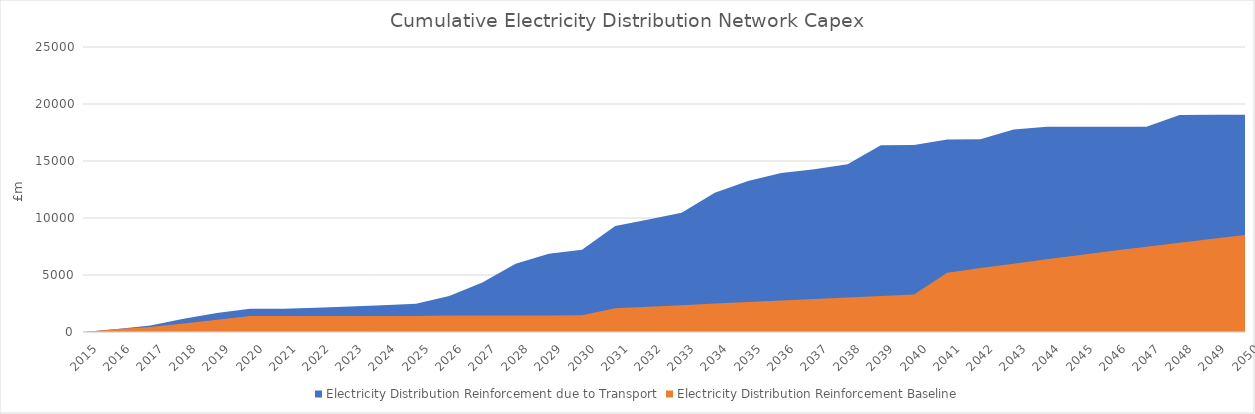
| Category | Electricity Distribution Reinforcement due to Transport | Electricity Distribution Reinforcement Baseline |
|---|---|---|
| 2015.0 | 0 | 0 |
| 2016.0 | 254.519 | 256.464 |
| 2017.0 | 573.45 | 440.448 |
| 2018.0 | 1169.89 | 741.664 |
| 2019.0 | 1665.083 | 1075.495 |
| 2020.0 | 2029.197 | 1403.056 |
| 2021.0 | 2037.778 | 1403.056 |
| 2022.0 | 2136.777 | 1403.056 |
| 2023.0 | 2238.898 | 1403.056 |
| 2024.0 | 2344.758 | 1403.056 |
| 2025.0 | 2471.359 | 1403.056 |
| 2026.0 | 3148.215 | 1438.606 |
| 2027.0 | 4341.44 | 1444.601 |
| 2028.0 | 5990.823 | 1447.8 |
| 2029.0 | 6870.009 | 1454.026 |
| 2030.0 | 7221.313 | 1460.06 |
| 2031.0 | 9294.881 | 2078.265 |
| 2032.0 | 9878.573 | 2218.727 |
| 2033.0 | 10470.76 | 2357.199 |
| 2034.0 | 12224.79 | 2494.673 |
| 2035.0 | 13246.29 | 2633.666 |
| 2036.0 | 13946.068 | 2768.179 |
| 2037.0 | 14281.092 | 2901.753 |
| 2038.0 | 14720.134 | 3034.017 |
| 2039.0 | 16387.1 | 3167.972 |
| 2040.0 | 16393.878 | 3298.436 |
| 2041.0 | 16894.736 | 5208.334 |
| 2042.0 | 16911.426 | 5607.481 |
| 2043.0 | 17758.47 | 5996.175 |
| 2044.0 | 17999.662 | 6379.651 |
| 2045.0 | 18000.154 | 6753.976 |
| 2046.0 | 18006.514 | 7121.71 |
| 2047.0 | 18009.861 | 7482.349 |
| 2048.0 | 19036.784 | 7837.303 |
| 2049.0 | 19062.305 | 8185.788 |
| 2050.0 | 19063.026 | 8525.859 |